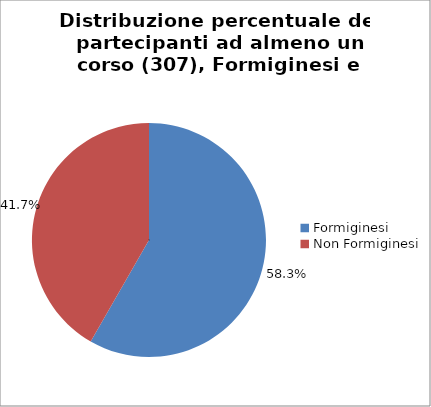
| Category | Nr. Tesserati |
|---|---|
| Formiginesi | 179 |
| Non Formiginesi | 128 |